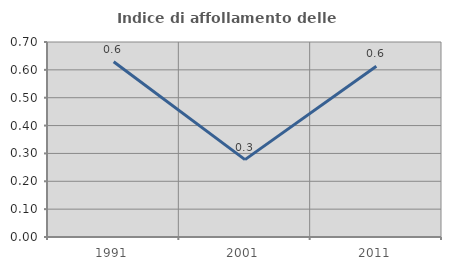
| Category | Indice di affollamento delle abitazioni  |
|---|---|
| 1991.0 | 0.629 |
| 2001.0 | 0.278 |
| 2011.0 | 0.613 |